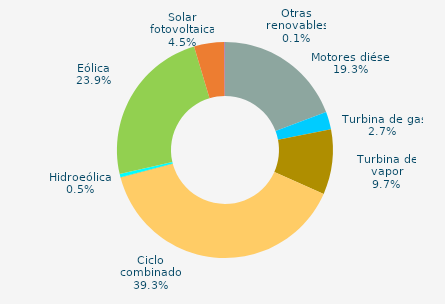
| Category | Series 0 |
|---|---|
| Motores diésel | 19.285 |
| Turbina de gas | 2.65 |
| Turbina de vapor | 9.726 |
| Ciclo combinado | 39.259 |
| Cogeneración | -0.001 |
| Hidráulica | 0.039 |
| Hidroeólica | 0.473 |
| Eólica | 23.945 |
| Solar fotovoltaica | 4.531 |
| Otras renovables | 0.091 |